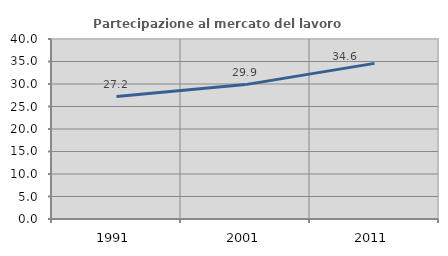
| Category | Partecipazione al mercato del lavoro  femminile |
|---|---|
| 1991.0 | 27.217 |
| 2001.0 | 29.863 |
| 2011.0 | 34.586 |